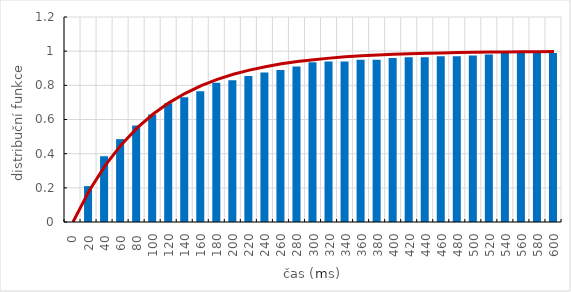
| Category | Series 0 |
|---|---|
| 0.0 | 0 |
| 20.0 | 0.21 |
| 40.0 | 0.385 |
| 60.0 | 0.485 |
| 80.0 | 0.565 |
| 100.0 | 0.63 |
| 120.0 | 0.695 |
| 140.0 | 0.73 |
| 160.0 | 0.765 |
| 180.0 | 0.815 |
| 200.0 | 0.83 |
| 220.0 | 0.855 |
| 240.0 | 0.875 |
| 260.0 | 0.89 |
| 280.0 | 0.91 |
| 300.0 | 0.935 |
| 320.0 | 0.94 |
| 340.0 | 0.94 |
| 360.0 | 0.95 |
| 380.0 | 0.95 |
| 400.0 | 0.96 |
| 420.0 | 0.965 |
| 440.0 | 0.965 |
| 460.0 | 0.97 |
| 480.0 | 0.97 |
| 500.0 | 0.975 |
| 520.0 | 0.98 |
| 540.0 | 0.99 |
| 560.0 | 0.99 |
| 580.0 | 0.99 |
| 600.0 | 0.99 |